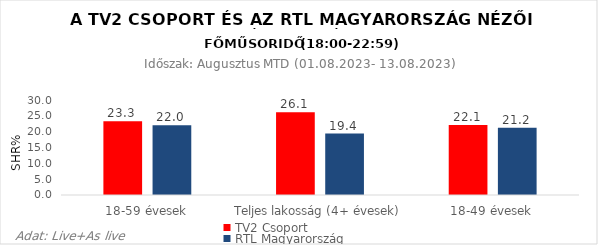
| Category | TV2 Csoport | RTL Magyarország |
|---|---|---|
| 18-59 évesek | 23.3 | 22 |
| Teljes lakosság (4+ évesek) | 26.1 | 19.4 |
| 18-49 évesek | 22.1 | 21.2 |